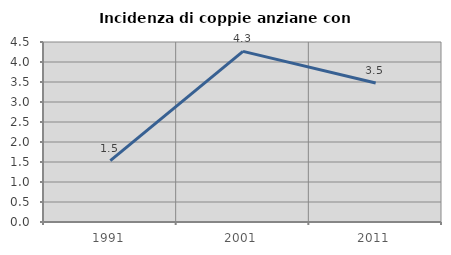
| Category | Incidenza di coppie anziane con figli |
|---|---|
| 1991.0 | 1.533 |
| 2001.0 | 4.265 |
| 2011.0 | 3.475 |